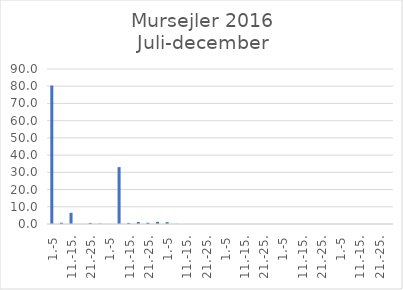
| Category | Series 0 |
|---|---|
| 1.-5 | 80.405 |
| 6.-10. | 0.751 |
| 11.-15. | 6.5 |
| 16.-20. | 0 |
| 21.-25. | 0.619 |
| 26.-31. | 0.251 |
| 1.-5 | 0 |
| 6.-10. | 33.016 |
| 11.-15. | 0.608 |
| 16.-20. | 1.125 |
| 21.-25. | 0.742 |
| 26.-31. | 1.251 |
| 1.-5 | 1.084 |
| 6.-10. | 0.07 |
| 11.-15. | 0 |
| 16.-20. | 0 |
| 21.-25. | 0 |
| 26.-30. | 0 |
| 1.-5 | 0.018 |
| 6.-10. | 0 |
| 11.-15. | 0 |
| 16.-20. | 0 |
| 21.-25. | 0 |
| 26.-31. | 0 |
| 1.-5 | 0 |
| 6.-10. | 0 |
| 11.-15. | 0 |
| 16.-20. | 0 |
| 21.-25. | 0 |
| 26.-30. | 0 |
| 1.-5 | 0 |
| 6.-10. | 0 |
| 11.-15. | 0 |
| 16.-20. | 0 |
| 21.-25. | 0 |
| 26.-31. | 0 |